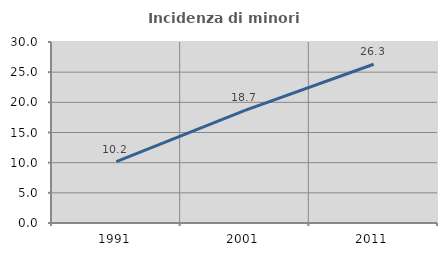
| Category | Incidenza di minori stranieri |
|---|---|
| 1991.0 | 10.169 |
| 2001.0 | 18.653 |
| 2011.0 | 26.316 |